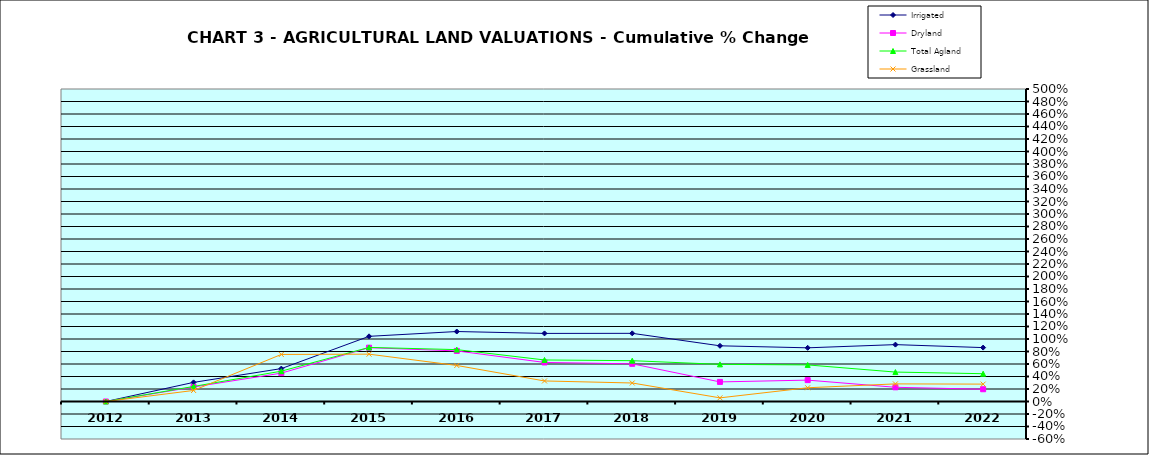
| Category | Irrigated | Dryland | Total Agland | Grassland |
|---|---|---|---|---|
| 2012.0 | 0 | 0 | 0 | 0 |
| 2013.0 | 0.306 | 0.232 | 0.241 | 0.177 |
| 2014.0 | 0.526 | 0.454 | 0.485 | 0.753 |
| 2015.0 | 1.043 | 0.861 | 0.865 | 0.757 |
| 2016.0 | 1.12 | 0.809 | 0.83 | 0.577 |
| 2017.0 | 1.089 | 0.625 | 0.665 | 0.329 |
| 2018.0 | 1.091 | 0.603 | 0.653 | 0.296 |
| 2019.0 | 0.891 | 0.313 | 0.594 | 0.058 |
| 2020.0 | 0.859 | 0.342 | 0.585 | 0.22 |
| 2021.0 | 0.91 | 0.227 | 0.471 | 0.282 |
| 2022.0 | 0.862 | 0.196 | 0.445 | 0.278 |